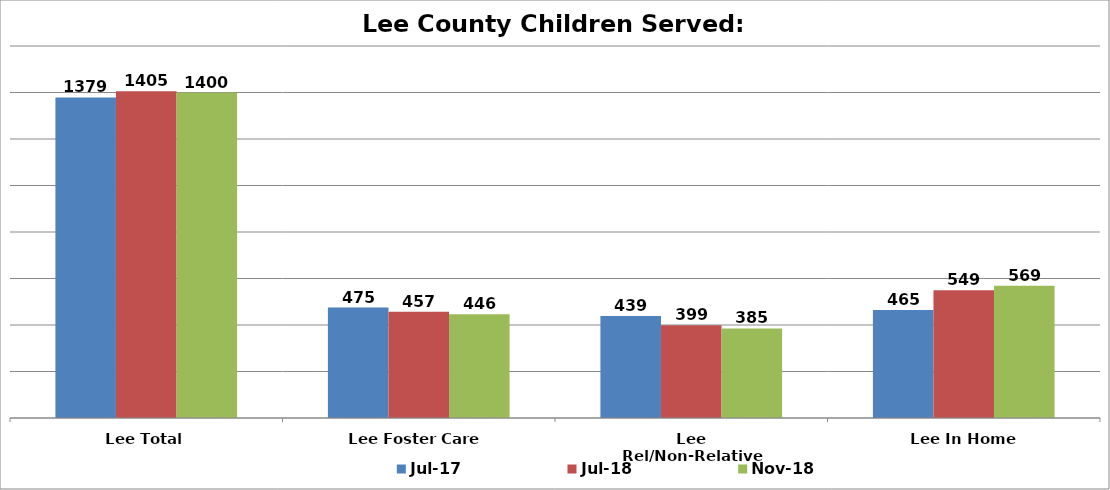
| Category | Jul-17 | Jul-18 | Nov-18 |
|---|---|---|---|
| Lee Total | 1379 | 1405 | 1400 |
| Lee Foster Care  | 475 | 457 | 446 |
| Lee Rel/Non-Relative | 439 | 399 | 385 |
| Lee In Home | 465 | 549 | 569 |